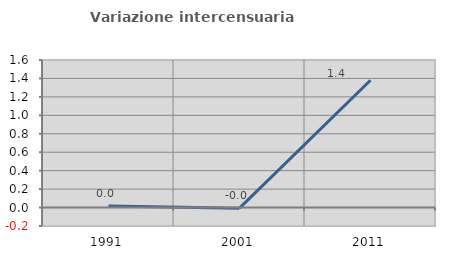
| Category | Variazione intercensuaria annua |
|---|---|
| 1991.0 | 0.016 |
| 2001.0 | -0.007 |
| 2011.0 | 1.38 |